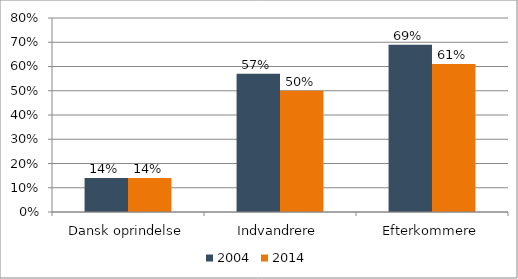
| Category | 2004 | 2014 |
|---|---|---|
| Dansk oprindelse | 0.14 | 0.14 |
| Indvandrere | 0.57 | 0.5 |
| Efterkommere | 0.69 | 0.61 |